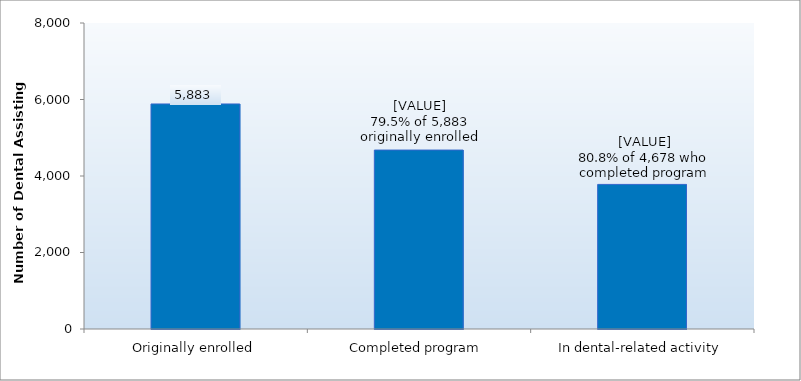
| Category | Series 0 |
|---|---|
| Originally enrolled | 5883 |
| Completed program | 4678 |
| In dental-related activity | 3780 |